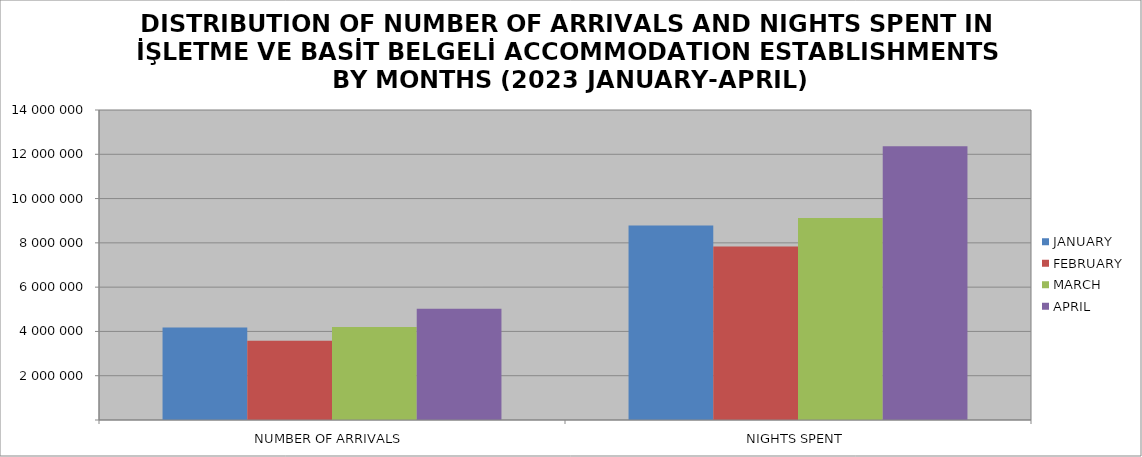
| Category | JANUARY | FEBRUARY | MARCH | APRIL |
|---|---|---|---|---|
| NUMBER OF ARRIVALS | 4176369 | 3577989 | 4200030 | 5022587 |
| NIGHTS SPENT | 8783046 | 7837722 | 9122802 | 12360237 |